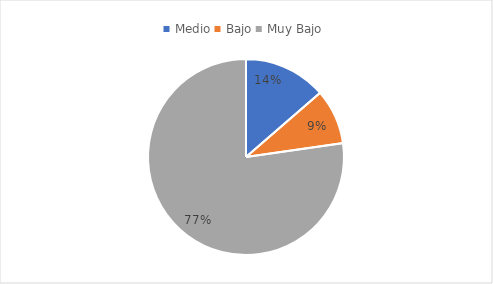
| Category | Series 0 |
|---|---|
| Medio | 0.136 |
| Bajo | 0.091 |
| Muy Bajo | 0.773 |